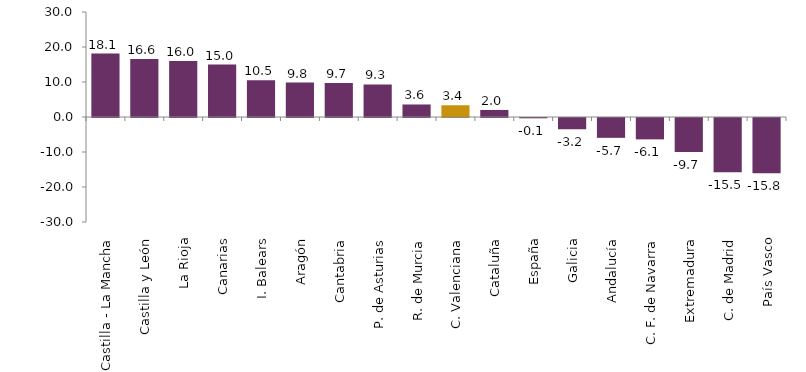
| Category | Precio medio del metro cuadrado de suelo urbano |
|---|---|
| Castilla - La Mancha | 18.122 |
| Castilla y León | 16.605 |
| La Rioja | 15.996 |
| Canarias | 14.987 |
| I. Balears | 10.472 |
| Aragón | 9.828 |
| Cantabria | 9.686 |
| P. de Asturias | 9.302 |
| R. de Murcia | 3.577 |
| C. Valenciana | 3.357 |
| Cataluña | 2.012 |
| España | -0.087 |
| Galicia | -3.213 |
| Andalucía | -5.668 |
| C. F. de Navarra | -6.106 |
| Extremadura | -9.734 |
| C. de Madrid | -15.5 |
| País Vasco | -15.778 |